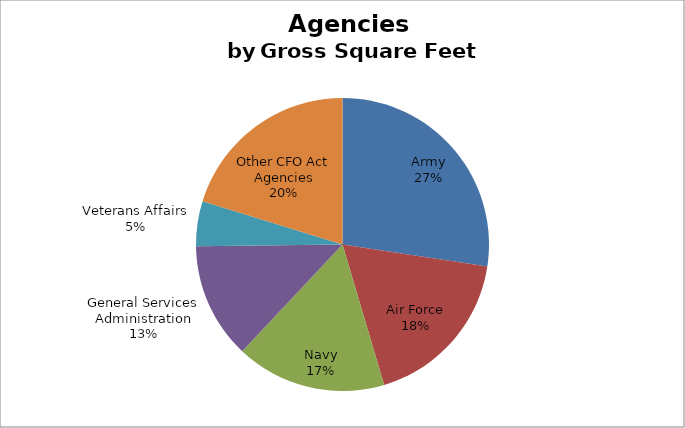
| Category | Series 0 |
|---|---|
| Army | 905026265.731 |
| Air Force | 594285849 |
| Navy | 547776682.32 |
| General Services Administration | 422832285.22 |
| Veterans Affairs | 164156963 |
| Other CFO Act Agencies | 667649041.148 |